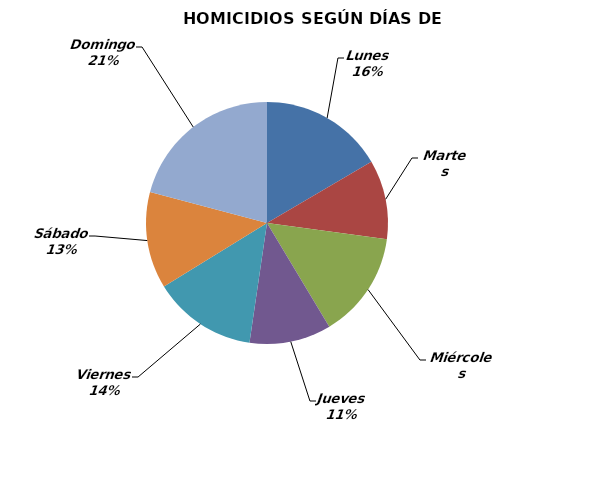
| Category | Series 0 |
|---|---|
| Lunes | 50 |
| Martes | 32 |
| Miércoles | 43 |
| Jueves | 33 |
| Viernes | 42 |
| Sábado | 39 |
| Domingo | 63 |